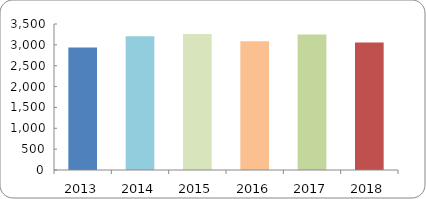
| Category | SERVICIOS TECNOLÓGICOS PROPORCIONADOS |
|---|---|
| 2013.0 | 2938 |
| 2014.0 | 3208 |
| 2015.0 | 3260 |
| 2016.0 | 3085 |
| 2017.0 | 3250 |
| 2018.0 | 3058 |